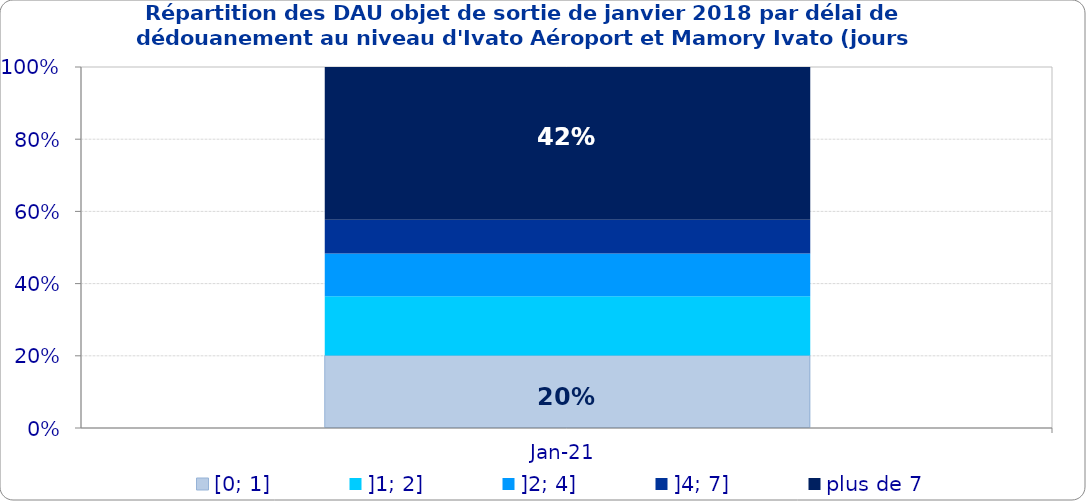
| Category | [0; 1] | ]1; 2] | ]2; 4] | ]4; 7] | plus de 7 |
|---|---|---|---|---|---|
| 2021-01-01 | 0.201 | 0.164 | 0.118 | 0.093 | 0.423 |